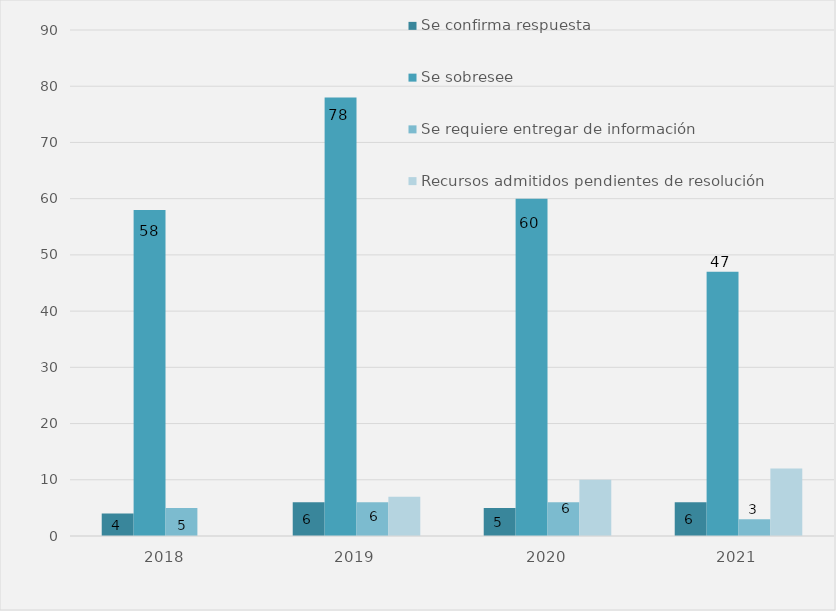
| Category | Se confirma respuesta | Se sobresee  | Se requiere entregar de información  | Recursos admitidos pendientes de resolución |
|---|---|---|---|---|
| 2018.0 | 4 | 58 | 5 | 0 |
| 2019.0 | 6 | 78 | 6 | 7 |
| 2020.0 | 5 | 60 | 6 | 10 |
| 2021.0 | 6 | 47 | 3 | 12 |